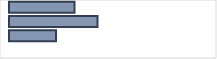
| Category | Series 0 |
|---|---|
| 0 | 32.587 |
| 1 | 44.027 |
| 2 | 23.387 |